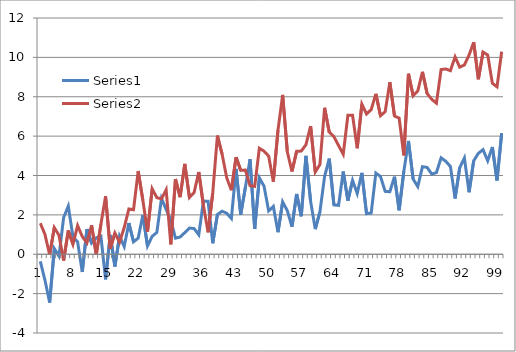
| Category | Series 0 | Series 1 |
|---|---|---|
| 0 | -0.36 | 1.575 |
| 1 | -1.323 | 1.002 |
| 2 | -2.452 | -0.028 |
| 3 | 0.287 | 1.353 |
| 4 | -0.094 | 0.96 |
| 5 | 1.864 | -0.316 |
| 6 | 2.45 | 1.205 |
| 7 | 0.887 | 0.509 |
| 8 | 0.628 | 1.457 |
| 9 | -0.898 | 0.899 |
| 10 | 1.278 | 0.577 |
| 11 | 0.567 | 1.473 |
| 12 | 0.836 | -0.03 |
| 13 | 0.921 | 1.523 |
| 14 | -1.274 | 2.944 |
| 15 | 0.978 | 0.274 |
| 16 | -0.625 | 1.078 |
| 17 | 0.923 | 0.611 |
| 18 | 0.391 | 1.356 |
| 19 | 1.587 | 2.303 |
| 20 | 0.632 | 2.258 |
| 21 | 0.818 | 4.224 |
| 22 | 1.995 | 2.741 |
| 23 | 0.422 | 1.14 |
| 24 | 0.911 | 3.323 |
| 25 | 1.106 | 2.878 |
| 26 | 2.834 | 2.811 |
| 27 | 2.275 | 3.274 |
| 28 | 1.738 | 0.502 |
| 29 | 0.817 | 3.822 |
| 30 | 0.876 | 2.9 |
| 31 | 1.098 | 4.589 |
| 32 | 1.331 | 2.886 |
| 33 | 1.305 | 3.135 |
| 34 | 0.991 | 4.178 |
| 35 | 2.701 | 2.481 |
| 36 | 2.694 | 1.114 |
| 37 | 0.558 | 3.113 |
| 38 | 2.018 | 6.027 |
| 39 | 2.185 | 5.089 |
| 40 | 2.087 | 3.886 |
| 41 | 1.824 | 3.251 |
| 42 | 4.336 | 4.935 |
| 43 | 2.015 | 4.261 |
| 44 | 3.395 | 4.278 |
| 45 | 4.832 | 3.483 |
| 46 | 1.283 | 3.448 |
| 47 | 3.882 | 5.383 |
| 48 | 3.461 | 5.239 |
| 49 | 2.2 | 4.985 |
| 50 | 2.427 | 3.686 |
| 51 | 1.12 | 6.308 |
| 52 | 2.662 | 8.091 |
| 53 | 2.215 | 5.208 |
| 54 | 1.397 | 4.206 |
| 55 | 3.062 | 5.228 |
| 56 | 1.93 | 5.241 |
| 57 | 4.999 | 5.564 |
| 58 | 2.689 | 6.508 |
| 59 | 1.276 | 4.175 |
| 60 | 2.157 | 4.561 |
| 61 | 3.947 | 7.44 |
| 62 | 4.853 | 6.203 |
| 63 | 2.509 | 5.973 |
| 64 | 2.482 | 5.521 |
| 65 | 4.201 | 5.08 |
| 66 | 2.723 | 7.06 |
| 67 | 3.752 | 7.062 |
| 68 | 3.088 | 5.385 |
| 69 | 4.132 | 7.622 |
| 70 | 2.06 | 7.128 |
| 71 | 2.095 | 7.347 |
| 72 | 4.123 | 8.148 |
| 73 | 3.948 | 7.035 |
| 74 | 3.193 | 7.24 |
| 75 | 3.175 | 8.736 |
| 76 | 3.94 | 7.021 |
| 77 | 2.234 | 6.918 |
| 78 | 4.206 | 5.019 |
| 79 | 5.756 | 9.168 |
| 80 | 3.816 | 8.051 |
| 81 | 3.438 | 8.298 |
| 82 | 4.448 | 9.264 |
| 83 | 4.41 | 8.16 |
| 84 | 4.068 | 7.867 |
| 85 | 4.15 | 7.674 |
| 86 | 4.898 | 9.382 |
| 87 | 4.723 | 9.411 |
| 88 | 4.458 | 9.324 |
| 89 | 2.835 | 10.026 |
| 90 | 4.401 | 9.502 |
| 91 | 4.889 | 9.614 |
| 92 | 3.15 | 10.117 |
| 93 | 4.748 | 10.77 |
| 94 | 5.128 | 8.89 |
| 95 | 5.312 | 10.271 |
| 96 | 4.749 | 10.12 |
| 97 | 5.446 | 8.687 |
| 98 | 3.75 | 8.504 |
| 99 | 6.153 | 10.291 |